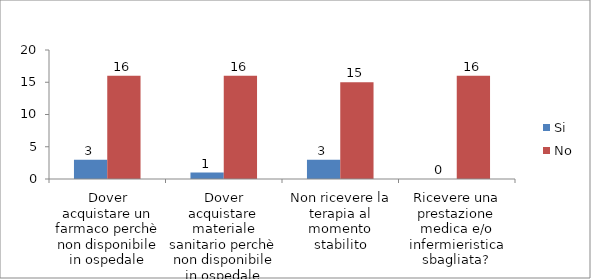
| Category | Si | No |
|---|---|---|
| Dover acquistare un farmaco perchè non disponibile in ospedale | 3 | 16 |
| Dover acquistare materiale sanitario perchè non disponibile in ospedale | 1 | 16 |
| Non ricevere la terapia al momento stabilito | 3 | 15 |
| Ricevere una prestazione medica e/o infermieristica sbagliata? | 0 | 16 |